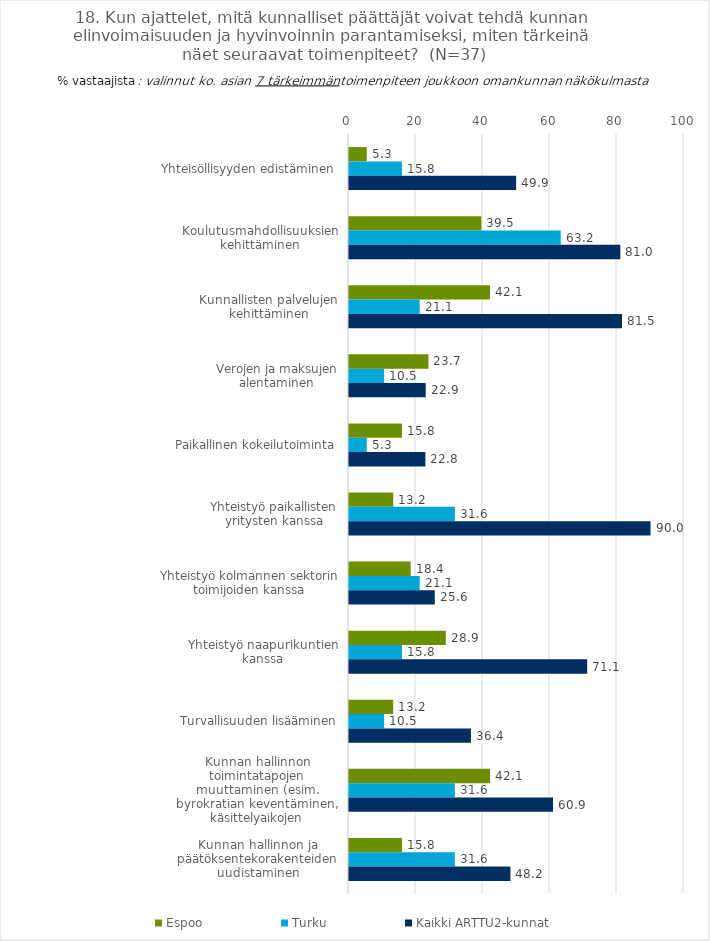
| Category | Espoo | Turku | Kaikki ARTTU2-kunnat |
|---|---|---|---|
| Yhteisöllisyyden edistäminen | 5.3 | 15.8 | 49.9 |
| Koulutusmahdollisuuksien kehittäminen | 39.5 | 63.2 | 81 |
| Kunnallisten palvelujen kehittäminen | 42.1 | 21.1 | 81.5 |
| Verojen ja maksujen alentaminen | 23.7 | 10.5 | 22.9 |
| Paikallinen kokeilutoiminta | 15.8 | 5.3 | 22.8 |
| Yhteistyö paikallisten yritysten kanssa | 13.2 | 31.6 | 90 |
| Yhteistyö kolmannen sektorin toimijoiden kanssa | 18.4 | 21.1 | 25.6 |
| Yhteistyö naapurikuntien kanssa | 28.9 | 15.8 | 71.1 |
| Turvallisuuden lisääminen | 13.2 | 10.5 | 36.4 |
| Kunnan hallinnon toimintatapojen muuttaminen (esim. byrokratian keventäminen, käsittelyaikojen lyhentäminen) | 42.1 | 31.6 | 60.9 |
| Kunnan hallinnon ja päätöksentekorakenteiden uudistaminen | 15.8 | 31.6 | 48.2 |